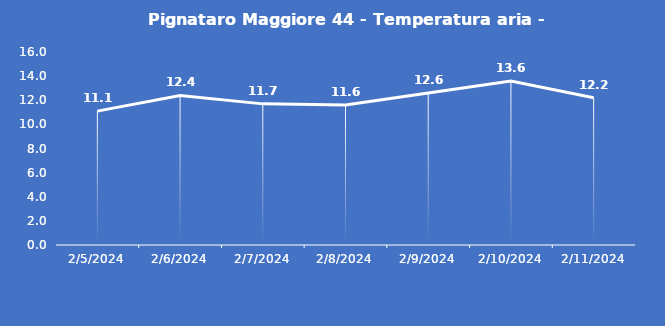
| Category | Pignataro Maggiore 44 - Temperatura aria - Grezzo (°C) |
|---|---|
| 2/5/24 | 11.1 |
| 2/6/24 | 12.4 |
| 2/7/24 | 11.7 |
| 2/8/24 | 11.6 |
| 2/9/24 | 12.6 |
| 2/10/24 | 13.6 |
| 2/11/24 | 12.2 |